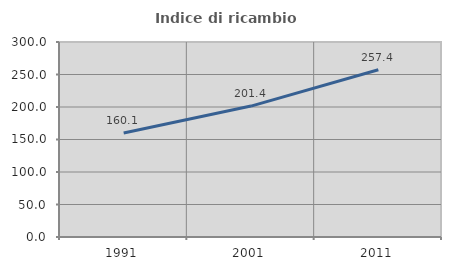
| Category | Indice di ricambio occupazionale  |
|---|---|
| 1991.0 | 160.135 |
| 2001.0 | 201.418 |
| 2011.0 | 257.377 |